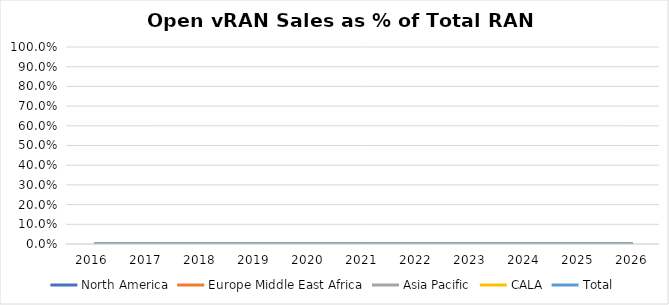
| Category | North America | Europe Middle East Africa | Asia Pacific | CALA | Total |
|---|---|---|---|---|---|
| 2016.0 | 0 | 0 | 0 | 0 | 0 |
| 2017.0 | 0 | 0 | 0 | 0 | 0 |
| 2018.0 | 0 | 0 | 0 | 0 | 0 |
| 2019.0 | 0 | 0 | 0 | 0 | 0 |
| 2020.0 | 0 | 0 | 0 | 0 | 0 |
| 2021.0 | 0 | 0 | 0 | 0 | 0 |
| 2022.0 | 0 | 0 | 0 | 0 | 0 |
| 2023.0 | 0 | 0 | 0 | 0 | 0 |
| 2024.0 | 0 | 0 | 0 | 0 | 0 |
| 2025.0 | 0 | 0 | 0 | 0 | 0 |
| 2026.0 | 0 | 0 | 0 | 0 | 0 |